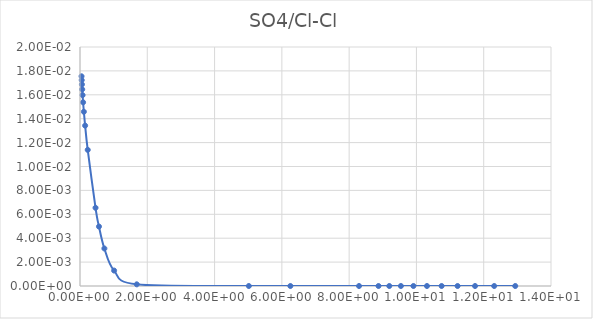
| Category | SO4/Cl |
|---|---|
| 0.045799 | 0.018 |
| 0.050887 | 0.017 |
| 0.057259 | 0.017 |
| 0.065457 | 0.016 |
| 0.076371 | 0.016 |
| 0.091686 | 0.015 |
| 0.11463 | 0.015 |
| 0.15299 | 0.013 |
| 0.22971 | 0.011 |
| 0.46165 | 0.007 |
| 0.56409 | 0.005 |
| 0.72494 | 0.003 |
| 1.0141 | 0.001 |
| 1.6871 | 0 |
| 5.0184 | 0 |
| 6.2531 | 0 |
| 8.2936 | 0 |
| 8.8726 | 0 |
| 9.1936 | 0 |
| 9.5386 | 0 |
| 9.9106 | 0 |
| 10.313 | 0 |
| 10.749 | 0 |
| 11.223 | 0 |
| 11.742 | 0 |
| 12.311 | 0 |
| 12.937 | 0 |